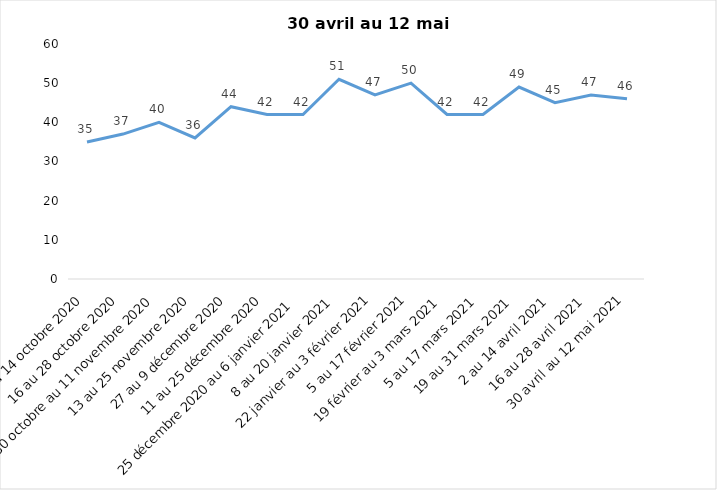
| Category | Toujours aux trois mesures |
|---|---|
| 2 au 14 octobre 2020 | 35 |
| 16 au 28 octobre 2020 | 37 |
| 30 octobre au 11 novembre 2020 | 40 |
| 13 au 25 novembre 2020 | 36 |
| 27 au 9 décembre 2020 | 44 |
| 11 au 25 décembre 2020 | 42 |
| 25 décembre 2020 au 6 janvier 2021 | 42 |
| 8 au 20 janvier 2021 | 51 |
| 22 janvier au 3 février 2021 | 47 |
| 5 au 17 février 2021 | 50 |
| 19 février au 3 mars 2021 | 42 |
| 5 au 17 mars 2021 | 42 |
| 19 au 31 mars 2021 | 49 |
| 2 au 14 avril 2021 | 45 |
| 16 au 28 avril 2021 | 47 |
| 30 avril au 12 mai 2021 | 46 |